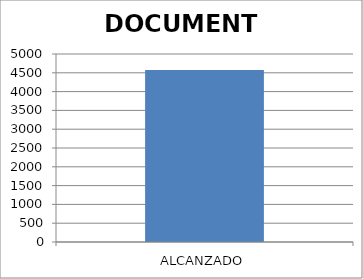
| Category | DOCUMENTO |
|---|---|
| ALCANZADO | 4575 |